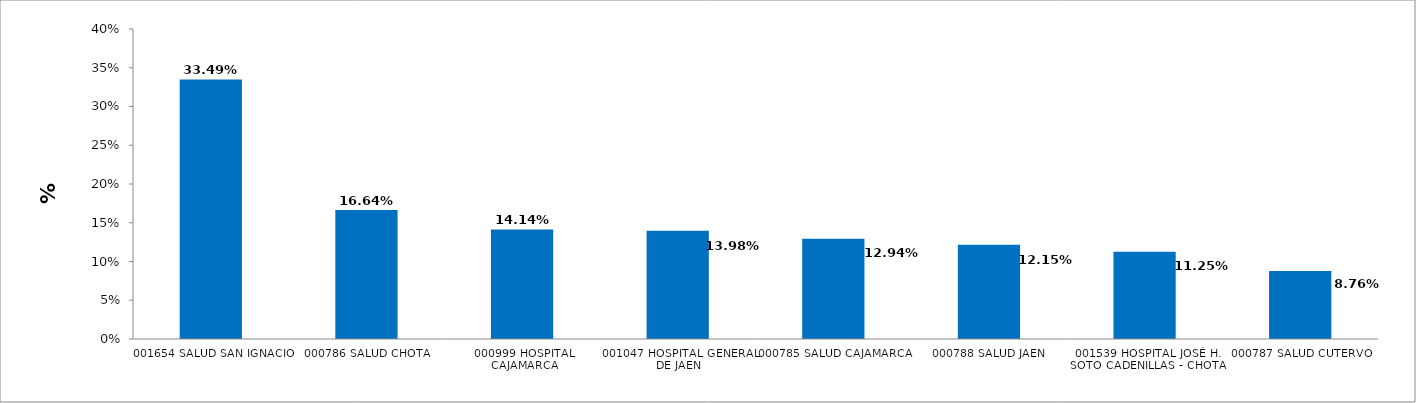
| Category | % VARIACIÓN |
|---|---|
| 001654 SALUD SAN IGNACIO | 0.335 |
| 000786 SALUD CHOTA | 0.166 |
| 000999 HOSPITAL CAJAMARCA | 0.141 |
| 001047 HOSPITAL GENERAL DE JAEN | 0.14 |
| 000785 SALUD CAJAMARCA | 0.129 |
| 000788 SALUD JAEN | 0.121 |
| 001539 HOSPITAL JOSÉ H. SOTO CADENILLAS - CHOTA | 0.112 |
| 000787 SALUD CUTERVO | 0.088 |